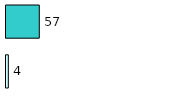
| Category | Series 0 | Series 1 |
|---|---|---|
| 0 | 4 | 57 |